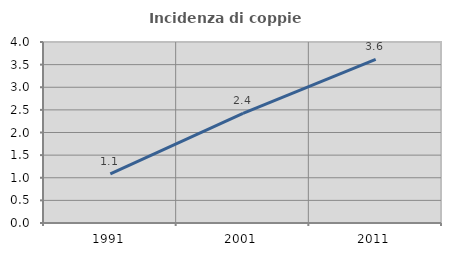
| Category | Incidenza di coppie miste |
|---|---|
| 1991.0 | 1.084 |
| 2001.0 | 2.423 |
| 2011.0 | 3.616 |